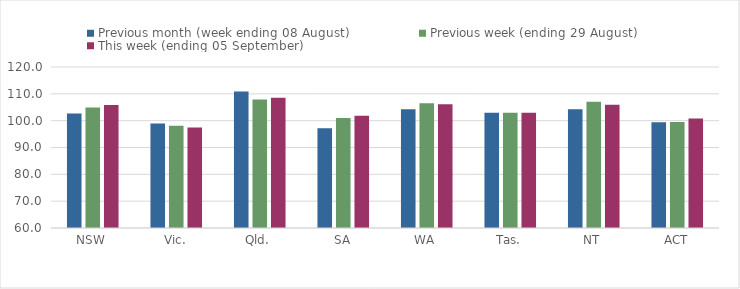
| Category | Previous month (week ending 08 August) | Previous week (ending 29 August) | This week (ending 05 September) |
|---|---|---|---|
| NSW | 102.69 | 104.91 | 105.82 |
| Vic. | 98.97 | 98.15 | 97.47 |
| Qld. | 110.85 | 107.9 | 108.58 |
| SA | 97.2 | 100.97 | 101.8 |
| WA | 104.27 | 106.5 | 106.12 |
| Tas. | 102.96 | 102.96 | 102.96 |
| NT | 104.22 | 107.02 | 105.91 |
| ACT | 99.38 | 99.48 | 100.78 |